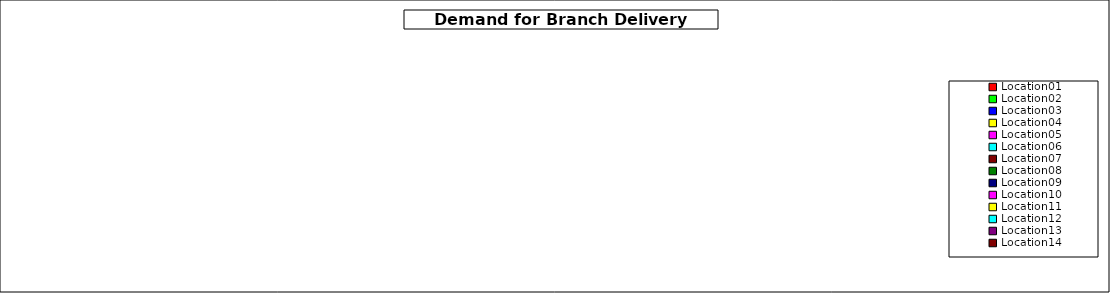
| Category | Data A |
|---|---|
| Location01 | 0 |
| Location02 | 0 |
| Location03 | 0 |
| Location04 | 0 |
| Location05 | 0 |
| Location06 | 0 |
| Location07 | 0 |
| Location08 | 0 |
| Location09 | 0 |
| Location10 | 0 |
| Location11 | 0 |
| Location12 | 0 |
| Location13 | 0 |
| Location14 | 0 |